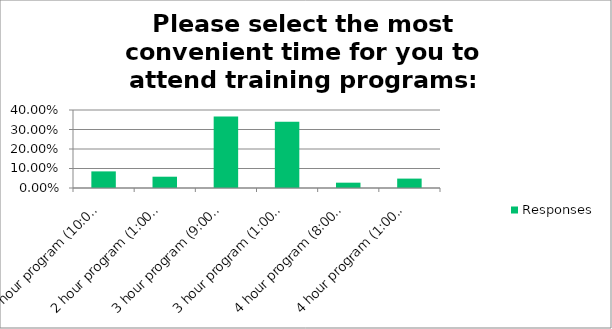
| Category | Responses |
|---|---|
| 2 hour program (10:00am-12:00pm) | 0.085 |
| 2 hour program (1:00pm-3:00pm) | 0.058 |
| 3 hour program (9:00am-12:00pm) | 0.367 |
| 3 hour program (1:00pm-4:00pm) | 0.339 |
| 4 hour program (8:00am-12pm) | 0.027 |
| 4 hour program (1:00pm-5:00pm) | 0.048 |